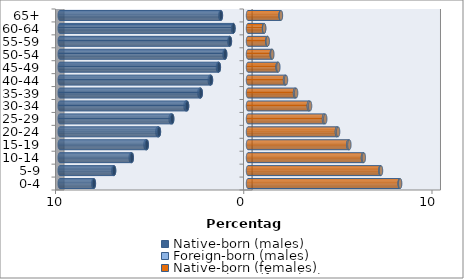
| Category | Native-born (males) | Foreign-born (males) | Native-born (females) | Foreign-born (females) |
|---|---|---|---|---|
| 0-4 | -8.187 | -0.03 | 8.058 | 0.025 |
| 5-9 | -7.115 | -0.042 | 7.032 | 0.033 |
| 10-14 | -6.174 | -0.058 | 6.108 | 0.045 |
| 15-19 | -5.376 | -0.069 | 5.331 | 0.054 |
| 20-24 | -4.732 | -0.08 | 4.723 | 0.064 |
| 25-29 | -4.028 | -0.082 | 4.037 | 0.066 |
| 30-34 | -3.237 | -0.079 | 3.233 | 0.065 |
| 35-39 | -2.509 | -0.07 | 2.498 | 0.058 |
| 40-44 | -1.967 | -0.062 | 1.967 | 0.052 |
| 45-49 | -1.548 | -0.048 | 1.573 | 0.04 |
| 50-54 | -1.213 | -0.037 | 1.262 | 0.031 |
| 55-59 | -0.961 | -0.026 | 1.026 | 0.02 |
| 60-64 | -0.773 | -0.018 | 0.85 | 0.011 |
| 65+ | -1.44 | -0.03 | 1.731 | 0.018 |